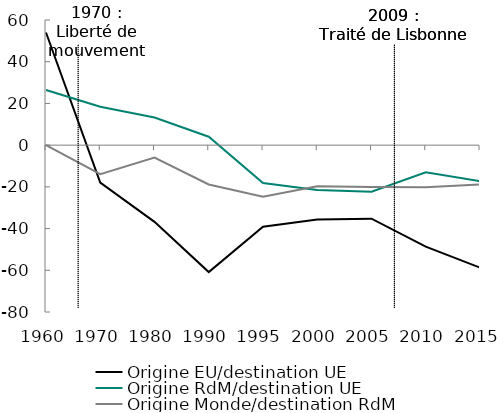
| Category | Origine EU/destination UE | Origine RdM/destination UE | Origine Monde/destination RdM |
|---|---|---|---|
| 1960.0 | 54.006 | 26.447 | 0 |
| 1970.0 | -17.924 | 18.444 | -13.892 |
| 1980.0 | -36.785 | 13.276 | -5.972 |
| 1990.0 | -60.854 | 4.042 | -18.863 |
| 1995.0 | -39.091 | -18.206 | -24.691 |
| 2000.0 | -35.608 | -21.457 | -19.662 |
| 2005.0 | -35.24 | -22.312 | -20.073 |
| 2010.0 | -48.66 | -12.986 | -20.201 |
| 2015.0 | -58.725 | -17.271 | -18.786 |